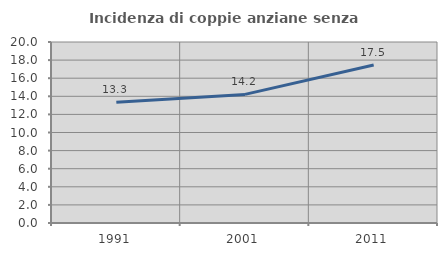
| Category | Incidenza di coppie anziane senza figli  |
|---|---|
| 1991.0 | 13.333 |
| 2001.0 | 14.211 |
| 2011.0 | 17.465 |